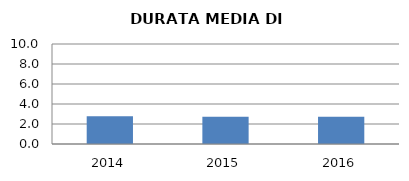
| Category | 2014 2015 2016 |
|---|---|
| 2014.0 | 2.771 |
| 2015.0 | 2.726 |
| 2016.0 | 2.727 |